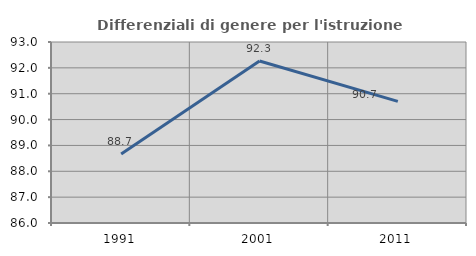
| Category | Differenziali di genere per l'istruzione superiore |
|---|---|
| 1991.0 | 88.664 |
| 2001.0 | 92.266 |
| 2011.0 | 90.706 |